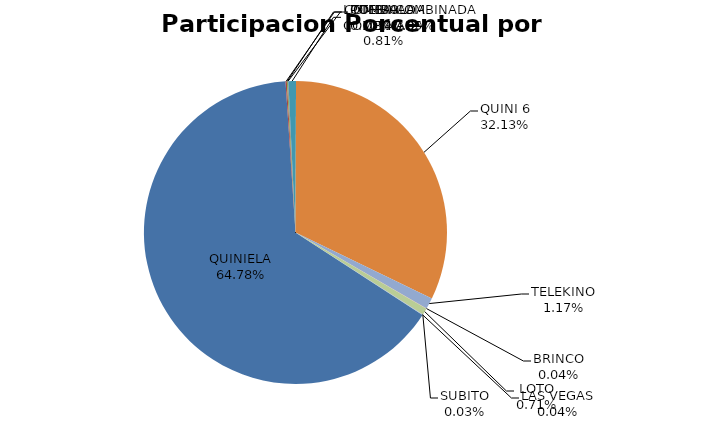
| Category | Series 0 |
|---|---|
| QUINIELA | 68004265.72 |
| COMBINADA | 144261.1 |
| LOTERIA | 115917.11 |
| POLLA COMBINADA | 55183.5 |
| TOMBOLA COMBINADA | 846046 |
| QUINI 6 | 33723557.72 |
| TELEKINO | 1231433.62 |
| BRINCO | 38171.87 |
| LOTO | 741088.34 |
| SUBITO | 34812 |
| LAS VEGAS | 37191 |